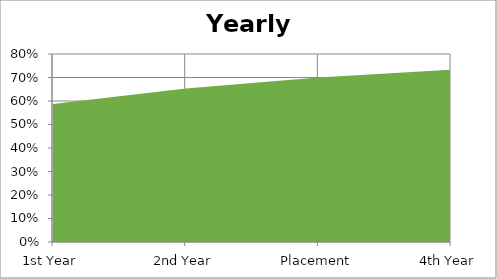
| Category | Yearly Progress |
|---|---|
| 1st Year | 0.588 |
| 2nd Year | 0.653 |
| Placement | 0.7 |
| 4th Year | 0.733 |